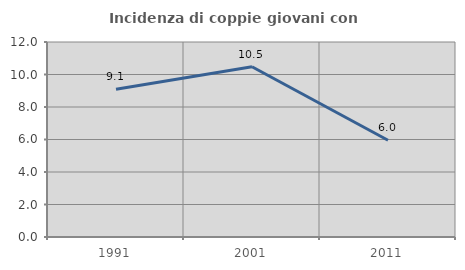
| Category | Incidenza di coppie giovani con figli |
|---|---|
| 1991.0 | 9.091 |
| 2001.0 | 10.476 |
| 2011.0 | 5.952 |